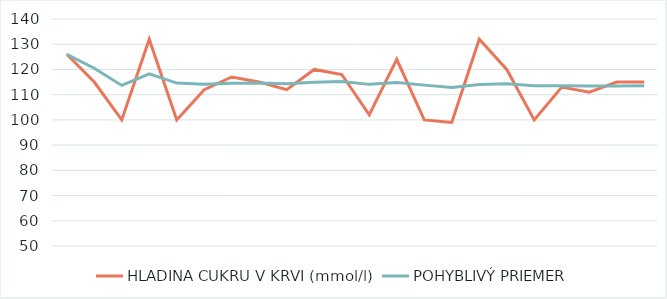
| Category | HLADINA CUKRU V KRVI (mmol/l) | POHYBLIVÝ PRIEMER |
|---|---|---|
| 0 | 126 | 126 |
| 1 | 115 | 120.5 |
| 2 | 100 | 113.667 |
| 3 | 132 | 118.25 |
| 4 | 100 | 114.6 |
| 5 | 112 | 114.167 |
| 6 | 117 | 114.571 |
| 7 | 115 | 114.625 |
| 8 | 112 | 114.333 |
| 9 | 120 | 114.9 |
| 10 | 118 | 115.182 |
| 11 | 102 | 114.083 |
| 12 | 124 | 114.846 |
| 13 | 100 | 113.786 |
| 14 | 99 | 112.8 |
| 15 | 132 | 114 |
| 16 | 120 | 114.353 |
| 17 | 100 | 113.556 |
| 18 | 113 | 113.526 |
| 19 | 111 | 113.4 |
| 20 | 115 | 113.476 |
| 21 | 115 | 113.545 |